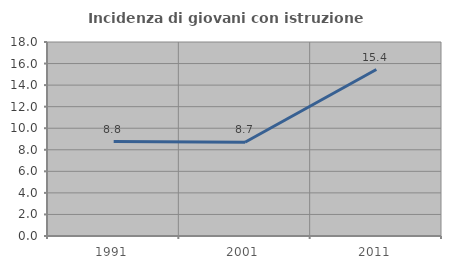
| Category | Incidenza di giovani con istruzione universitaria |
|---|---|
| 1991.0 | 8.765 |
| 2001.0 | 8.699 |
| 2011.0 | 15.443 |